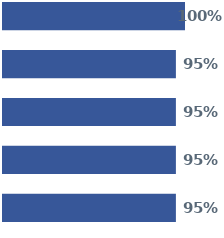
| Category | Series 0 | Series 1 | Series 2 | Series 3 | Series 4 |
|---|---|---|---|---|---|
| 0 | 1 | 0.95 | 0.95 | 0.95 | 0.95 |